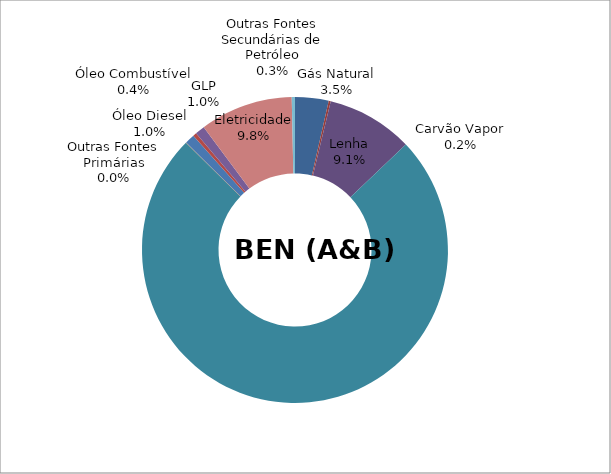
| Category | Series 0 |
|---|---|
| Gás Natural | 0.035 |
| Carvão Vapor | 0.002 |
| Carvão Metalúrgico | 0 |
| Lenha | 0.091 |
| Produtos da Cana | 0.745 |
| Outras Fontes Primárias | 0 |
| Óleo Diesel | 0.01 |
| Óleo Combustível | 0.004 |
| Gasolina | 0 |
| GLP | 0.01 |
| Querosene | 0 |
| Gases de Processo | 0 |
| Coque de Carvão Mineral | 0 |
| Eletricidade | 0.098 |
| Carvão vegetal | 0 |
| Álcool Etíllico | 0 |
| Outras Fontes Secundárias de Petróleo | 0.003 |
| Alcatrão | 0 |